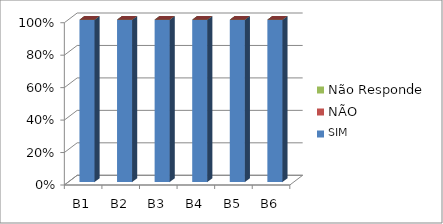
| Category | SIM | NÃO  | Não Responde |
|---|---|---|---|
| B1 | 9 | 0 | 0 |
| B2 | 9 | 0 | 0 |
| B3 | 9 | 0 | 0 |
| B4 | 9 | 0 | 0 |
| B5 | 9 | 0 | 0 |
| B6 | 9 | 0 | 0 |